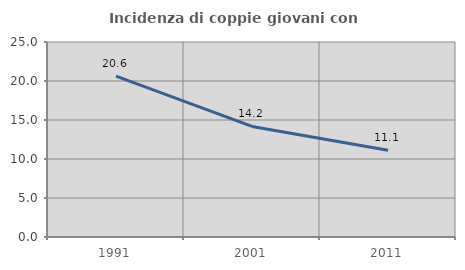
| Category | Incidenza di coppie giovani con figli |
|---|---|
| 1991.0 | 20.619 |
| 2001.0 | 14.173 |
| 2011.0 | 11.135 |